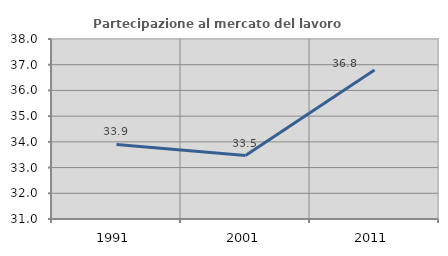
| Category | Partecipazione al mercato del lavoro  femminile |
|---|---|
| 1991.0 | 33.898 |
| 2001.0 | 33.468 |
| 2011.0 | 36.792 |